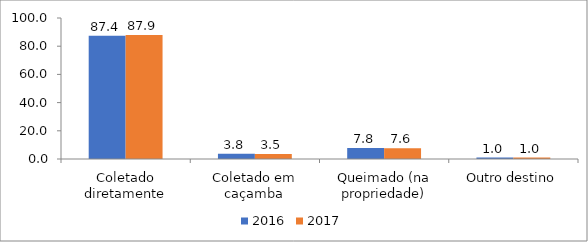
| Category | 2016 | 2017 |
|---|---|---|
| Coletado diretamente | 87.4 | 87.9 |
| Coletado em caçamba | 3.8 | 3.5 |
| Queimado (na propriedade) | 7.8 | 7.6 |
| Outro destino | 1 | 1 |